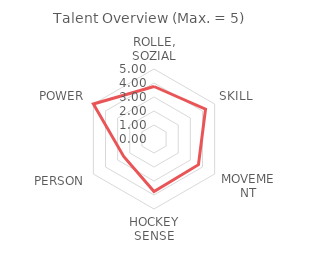
| Category | Series 2 |
|---|---|
| ROLLE, SOZIAL | 3.75 |
| SKILL | 4.25 |
| MOVEMENT | 3.667 |
| HOCKEY SENSE | 3.75 |
| PERSON | 2.5 |
| POWER | 5 |